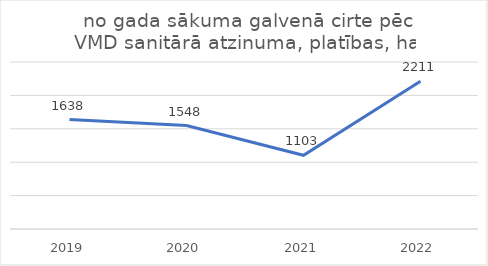
| Category | no gada sākuma galvenā cirte pēc VMD sanitārā atzinuma, platības, ha |
|---|---|
| 2019.0 | 1638 |
| 2020.0 | 1548 |
| 2021.0 | 1103 |
| 2022.0 | 2211 |